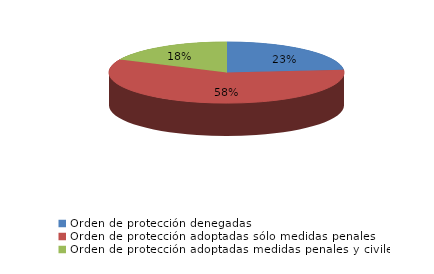
| Category | Series 0 |
|---|---|
| Orden de protección denegadas | 43 |
| Orden de protección adoptadas sólo medidas penales | 107 |
| Orden de protección adoptadas medidas penales y civiles | 33 |